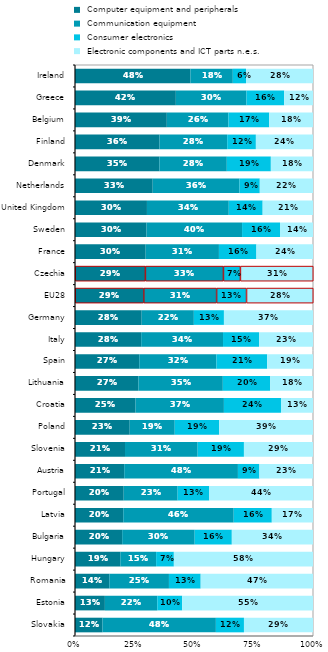
| Category |  Computer equipment and peripherals |  Communication equipment |  Consumer electronics |  Electronic components and ICT parts n.e.s. |
|---|---|---|---|---|
| Slovakia | 0.115 | 0.477 | 0.118 | 0.29 |
| Estonia | 0.126 | 0.22 | 0.104 | 0.55 |
| Romania | 0.144 | 0.251 | 0.133 | 0.472 |
| Hungary | 0.19 | 0.151 | 0.075 | 0.585 |
| Bulgaria | 0.198 | 0.305 | 0.156 | 0.341 |
| Latvia | 0.203 | 0.464 | 0.16 | 0.173 |
| Portugal | 0.205 | 0.227 | 0.133 | 0.436 |
| Austria | 0.207 | 0.478 | 0.09 | 0.225 |
| Slovenia | 0.21 | 0.305 | 0.194 | 0.29 |
| Poland | 0.23 | 0.189 | 0.187 | 0.394 |
| Croatia | 0.254 | 0.371 | 0.24 | 0.134 |
| Lithuania | 0.266 | 0.355 | 0.199 | 0.18 |
| Spain | 0.27 | 0.324 | 0.213 | 0.193 |
| Italy | 0.278 | 0.344 | 0.151 | 0.227 |
| Germany | 0.28 | 0.219 | 0.126 | 0.374 |
| EU28 | 0.288 | 0.306 | 0.126 | 0.28 |
| Czechia | 0.295 | 0.328 | 0.071 | 0.306 |
| France | 0.297 | 0.308 | 0.158 | 0.238 |
| Sweden | 0.3 | 0.402 | 0.159 | 0.139 |
| United Kingdom | 0.302 | 0.344 | 0.142 | 0.212 |
| Netherlands | 0.326 | 0.365 | 0.085 | 0.224 |
| Denmark | 0.355 | 0.283 | 0.185 | 0.177 |
| Finland | 0.355 | 0.284 | 0.121 | 0.24 |
| Belgium | 0.386 | 0.259 | 0.171 | 0.184 |
| Greece | 0.424 | 0.297 | 0.158 | 0.121 |
| Ireland | 0.485 | 0.178 | 0.056 | 0.281 |